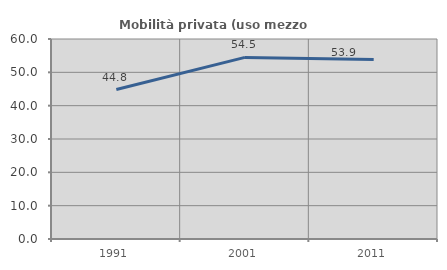
| Category | Mobilità privata (uso mezzo privato) |
|---|---|
| 1991.0 | 44.844 |
| 2001.0 | 54.483 |
| 2011.0 | 53.854 |